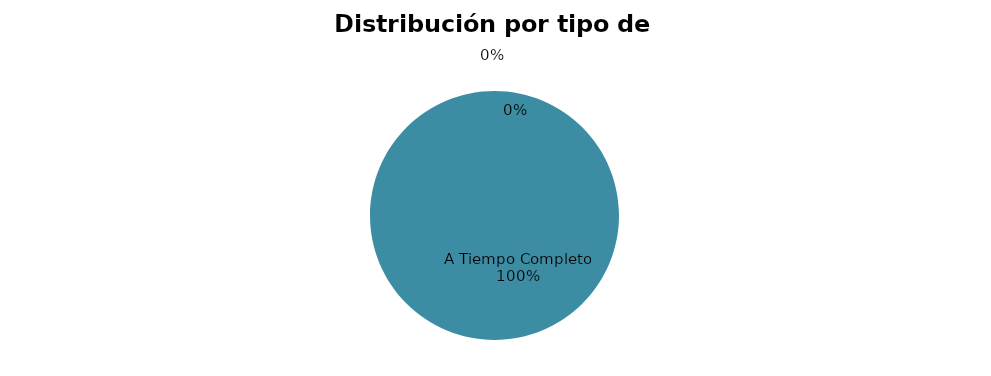
| Category | 5 |
|---|---|
| A Tiempo Completo | 5 |